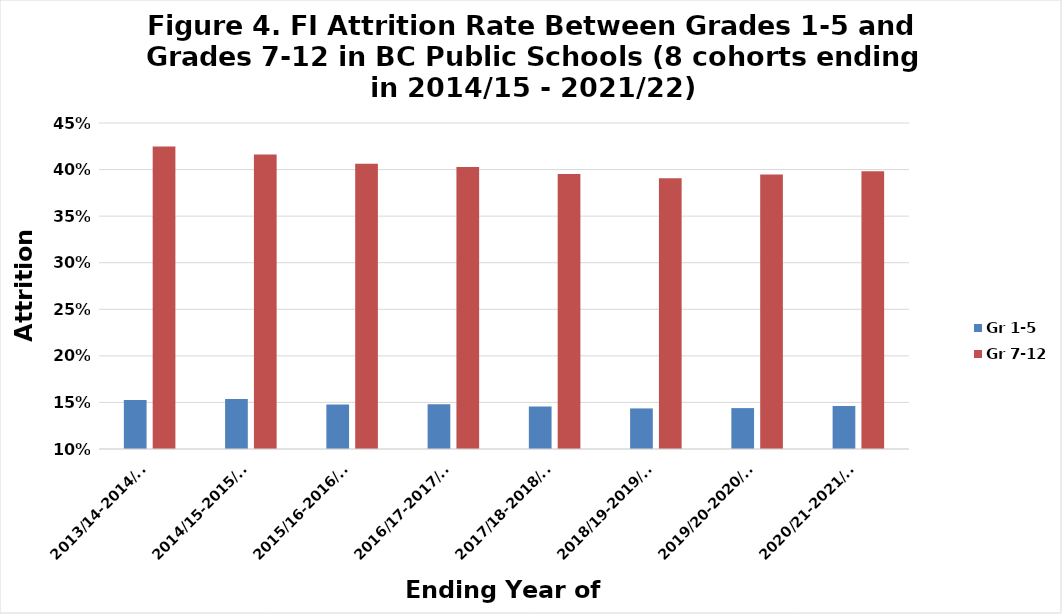
| Category | Gr 1-5 | Gr 7-12 |
|---|---|---|
| 2013/14-2014/15 | 0.153 | 0.425 |
| 2014/15-2015/16 | 0.154 | 0.416 |
| 2015/16-2016/17 | 0.148 | 0.406 |
| 2016/17-2017/18 | 0.148 | 0.403 |
| 2017/18-2018/19 | 0.146 | 0.395 |
| 2018/19-2019/20 | 0.144 | 0.391 |
| 2019/20-2020/21 | 0.144 | 0.395 |
| 2020/21-2021/22 | 0.146 | 0.398 |